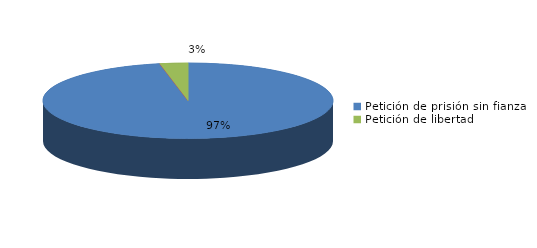
| Category | Series 0 |
|---|---|
| Petición de prisión sin fianza | 31 |
| Peticion de libertad con fianza | 0 |
| Petición de libertad | 1 |